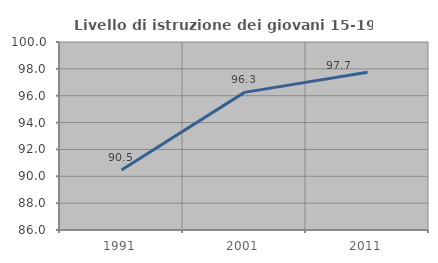
| Category | Livello di istruzione dei giovani 15-19 anni |
|---|---|
| 1991.0 | 90.463 |
| 2001.0 | 96.25 |
| 2011.0 | 97.748 |